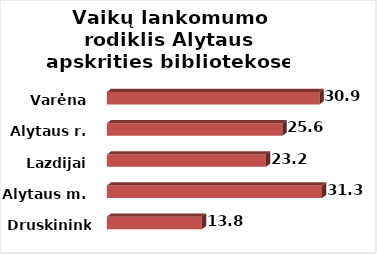
| Category | Series 0 |
|---|---|
| Druskininkai | 13.83 |
| Alytaus m. | 31.31 |
| Lazdijai | 23.15 |
| Alytaus r. | 25.57 |
| Varėna | 30.93 |